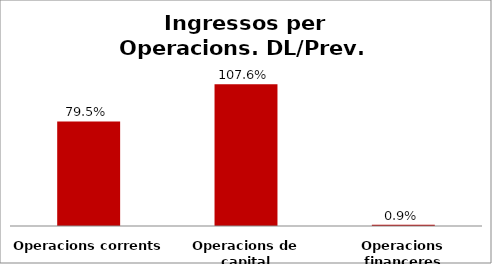
| Category | Series 0 |
|---|---|
| Operacions corrents | 0.795 |
| Operacions de capital | 1.076 |
| Operacions financeres | 0.009 |